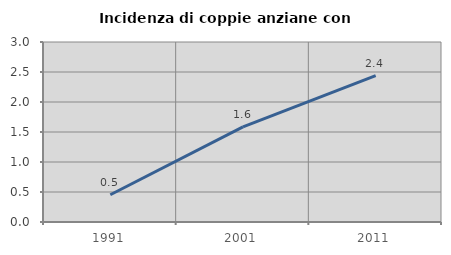
| Category | Incidenza di coppie anziane con figli |
|---|---|
| 1991.0 | 0.455 |
| 2001.0 | 1.585 |
| 2011.0 | 2.439 |